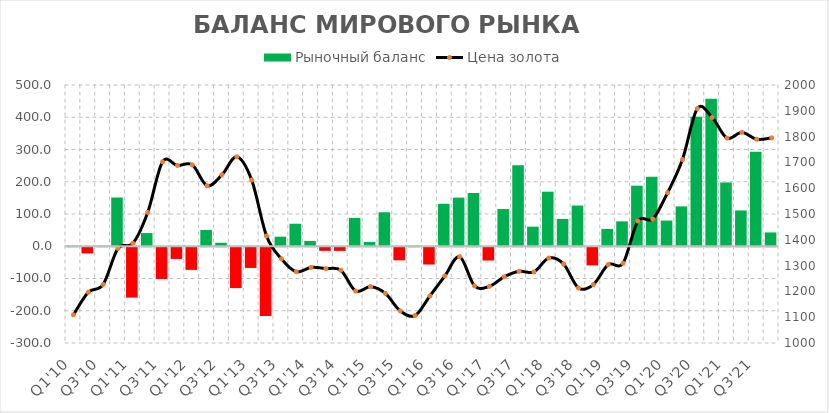
| Category | Рыночный баланс |
|---|---|
| Q1'10 | 1.878 |
| Q2'10 | -19.209 |
| Q3'10 | 1.645 |
| Q4'10 | 151.173 |
| Q1'11 | -156.134 |
| Q2'11 | 40.887 |
| Q3'11 | -98.429 |
| Q4'11 | -36.183 |
| Q1'12 | -70.205 |
| Q2'12 | 50.481 |
| Q3'12 | 10.719 |
| Q4'12 | -126.629 |
| Q1'13 | -64.175 |
| Q2'13 | -213.135 |
| Q3'13 | 29.632 |
| Q4'13 | 69.795 |
| Q1'14 | 16.557 |
| Q2'14 | -11.217 |
| Q3'14 | -11.25 |
| Q4'14 | 87.817 |
| Q1'15 | 13.289 |
| Q2'15 | 105.42 |
| Q3'15 | -40.553 |
| Q4'15 | 1.38 |
| Q1'16 | -53.567 |
| Q2'16 | 131.726 |
| Q3'16 | 150.765 |
| Q4'16 | 165.035 |
| Q1'17 | -41.077 |
| Q2'17 | 115.651 |
| Q3'17 | 251.195 |
| Q4'17 | 60.723 |
| Q1'18 | 169.157 |
| Q2'18 | 84.837 |
| Q3'18 | 126.273 |
| Q4'18 | -56.313 |
| Q1'19 | 53.614 |
| Q2'19 | 77.186 |
| Q3'19 | 187.853 |
| Q4'19 | 215.703 |
| Q1'20 | 79.715 |
| Q2'20 | 123.595 |
| Q3'20 | 401.231 |
| Q4'20 | 457.735 |
| Q1'21 | 197.758 |
| Q2'21 | 111.014 |
| Q3'21 | 293.212 |